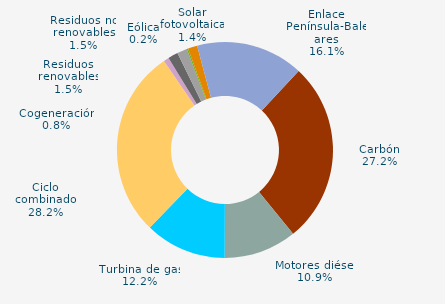
| Category | Series 0 |
|---|---|
| Carbón | 27.2 |
| Motores diésel | 10.9 |
| Turbina de gas | 12.2 |
| Ciclo combinado | 28.2 |
| Generación auxiliar | 0 |
| Cogeneración | 0.8 |
| Residuos no renovables | 1.5 |
| Residuos renovables | 1.5 |
| Eólica | 0.2 |
| Solar fotovoltaica | 1.4 |
| Otras renovables | 0 |
| Enlace Península-Baleares | 16.1 |